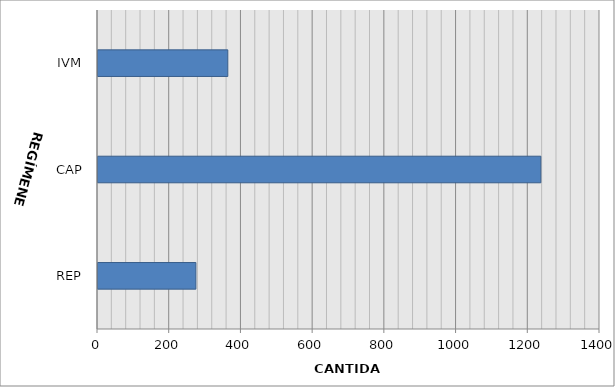
| Category | Series 0 |
|---|---|
| REP | 273 |
| CAP | 1235 |
| IVM | 362 |